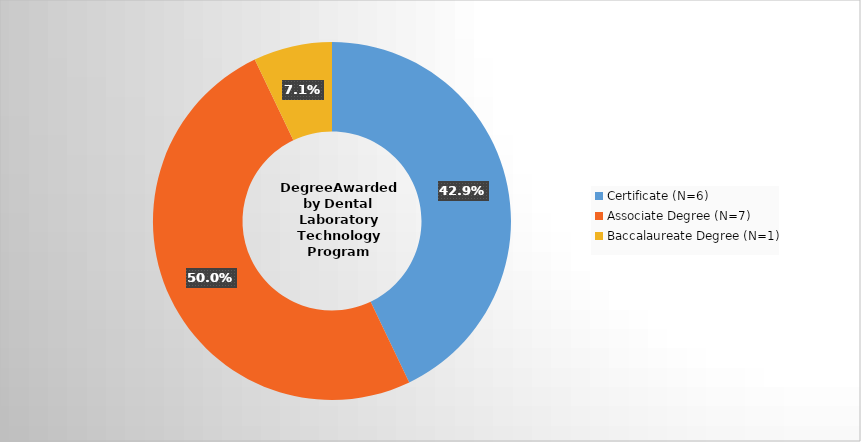
| Category | Series 0 |
|---|---|
| Certificate (N=6) | 0.429 |
| Associate Degree (N=7) | 0.5 |
| Baccalaureate Degree (N=1) | 0.071 |